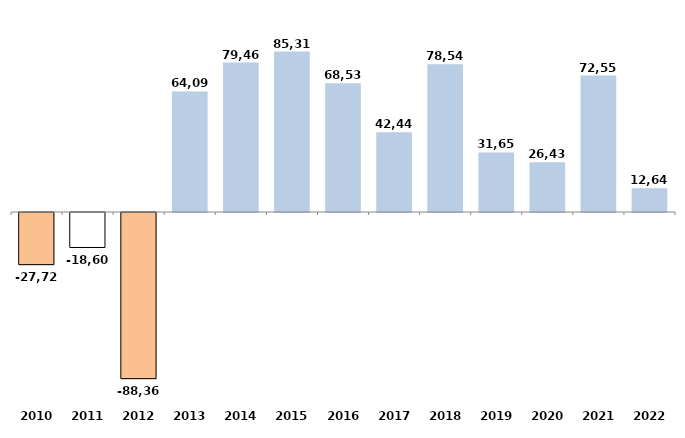
| Category | Series 0 |
|---|---|
| 2010 | -27727.75 |
| 2011 | -18608.8 |
| 2012 | -88366.91 |
| 2013 | 64096.85 |
| 2014 | 79462.77 |
| 2015 | 85313.53 |
| 2016 | 68530.62 |
| 2017 | 42444.32 |
| 2018 | 78540.98 |
| 2019 | 31659.38 |
| 2020 | 26432 |
| 2021 | 72553 |
| 2022 | 12639.995 |